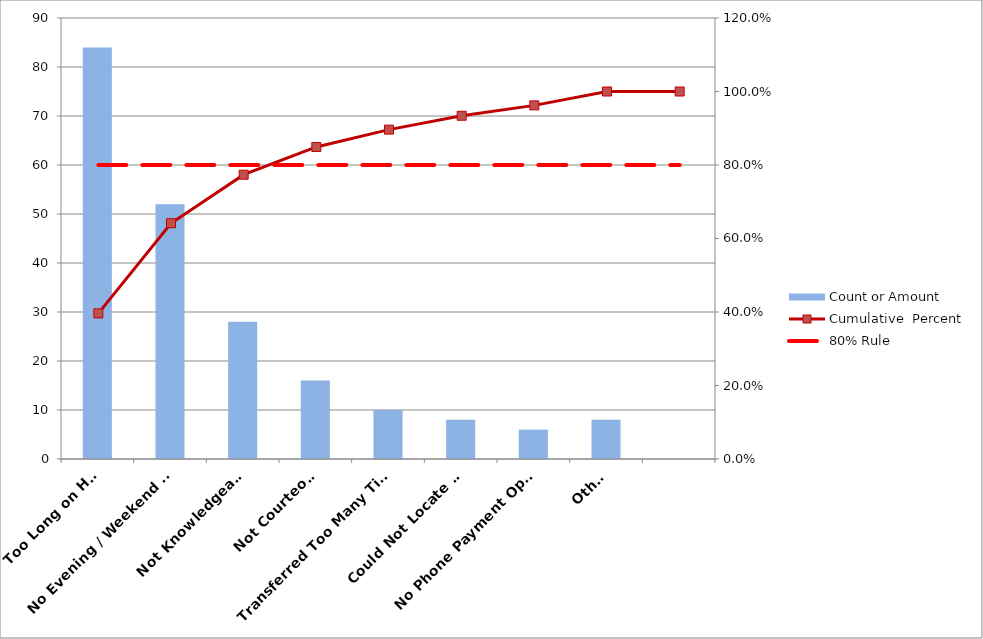
| Category | Count or Amount |
|---|---|
| Too Long on Hold | 84 |
| No Evening / Weekend Staff | 52 |
| Not Knowledgeable | 28 |
| Not Courteous | 16 |
| Transferred Too Many Times | 10 |
| Could Not Locate File | 8 |
| No Phone Payment Option | 6 |
| Other | 8 |